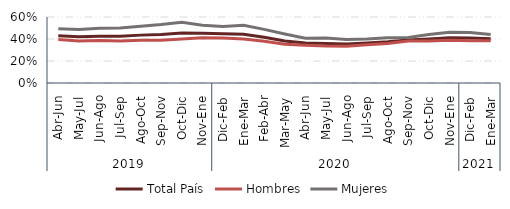
| Category | Total País | Hombres | Mujeres |
|---|---|---|---|
| 0 | 0.43 | 0.396 | 0.493 |
| 1 | 0.42 | 0.383 | 0.487 |
| 2 | 0.426 | 0.386 | 0.497 |
| 3 | 0.425 | 0.382 | 0.501 |
| 4 | 0.435 | 0.39 | 0.516 |
| 5 | 0.44 | 0.39 | 0.531 |
| 6 | 0.454 | 0.399 | 0.551 |
| 7 | 0.452 | 0.411 | 0.525 |
| 8 | 0.447 | 0.409 | 0.513 |
| 9 | 0.444 | 0.4 | 0.525 |
| 10 | 0.416 | 0.379 | 0.487 |
| 11 | 0.382 | 0.352 | 0.445 |
| 12 | 0.364 | 0.344 | 0.408 |
| 13 | 0.359 | 0.336 | 0.409 |
| 14 | 0.354 | 0.335 | 0.396 |
| 15 | 0.364 | 0.347 | 0.401 |
| 16 | 0.375 | 0.358 | 0.411 |
| 17 | 0.391 | 0.381 | 0.414 |
| 18 | 0.4 | 0.383 | 0.44 |
| 19 | 0.411 | 0.389 | 0.461 |
| 20 | 0.408 | 0.384 | 0.46 |
| 21 | 0.402 | 0.384 | 0.441 |